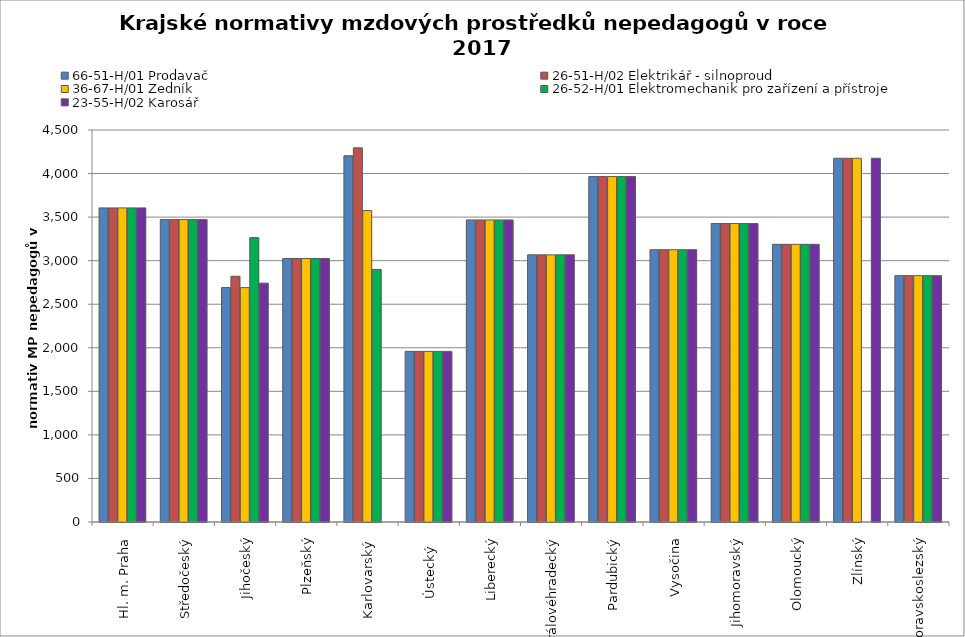
| Category | 66-51-H/01 Prodavač | 26-51-H/02 Elektrikář - silnoproud | 36-67-H/01 Zedník | 26-52-H/01 Elektromechanik pro zařízení a přístroje | 23-55-H/02 Karosář |
|---|---|---|---|---|---|
| Hl. m. Praha | 3605.806 | 3605.806 | 3605.806 | 3605.806 | 3605.806 |
| Středočeský | 3471.309 | 3471.309 | 3471.309 | 3471.309 | 3471.309 |
| Jihočeský | 2690.773 | 2820.849 | 2690.814 | 3264.4 | 2741.92 |
| Plzeňský | 3024.545 | 3024.545 | 3024.545 | 3024.545 | 3024.545 |
| Karlovarský  | 4204.259 | 4294.837 | 3575.463 | 2899.558 | 0 |
| Ústecký   | 1958.474 | 1958.474 | 1958.474 | 1958.474 | 1958.474 |
| Liberecký | 3467.889 | 3467.889 | 3467.889 | 3467.889 | 3467.889 |
| Královéhradecký | 3066.898 | 3066.898 | 3066.898 | 3066.898 | 3066.898 |
| Pardubický | 3965.455 | 3965.455 | 3965.455 | 3965.455 | 3965.455 |
| Vysočina | 3125.692 | 3125.692 | 3125.692 | 3125.692 | 3125.692 |
| Jihomoravský | 3426.326 | 3426.326 | 3426.326 | 3426.326 | 3426.326 |
| Olomoucký | 3187.482 | 3187.482 | 3187.482 | 3187.482 | 3187.482 |
| Zlínský | 4175.51 | 4175.51 | 4175.51 | 0 | 4175.51 |
| Moravskoslezský | 2828.209 | 2828.209 | 2828.209 | 2828.209 | 2828.209 |